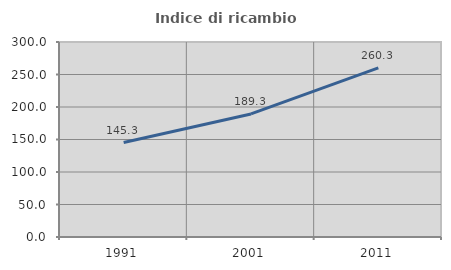
| Category | Indice di ricambio occupazionale  |
|---|---|
| 1991.0 | 145.27 |
| 2001.0 | 189.306 |
| 2011.0 | 260.323 |